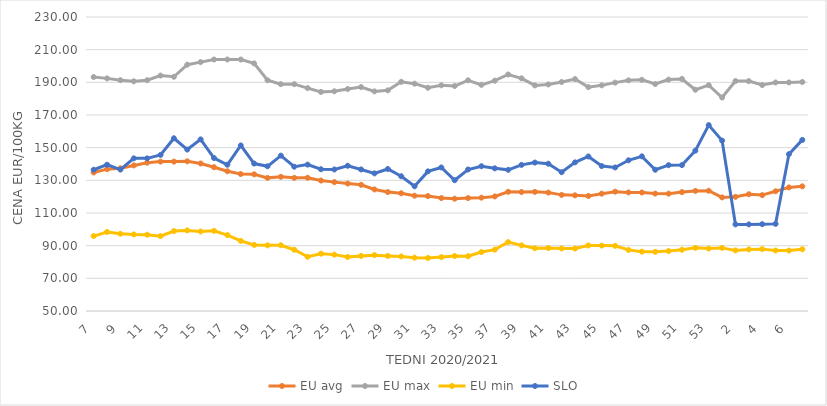
| Category | EU avg | EU max | EU min | SLO |
|---|---|---|---|---|
| 7.0 | 134.799 | 193.24 | 95.88 | 136.47 |
| 8.0 | 136.846 | 192.42 | 98.381 | 139.56 |
| 9.0 | 137.361 | 191.31 | 97.323 | 136.58 |
| 10.0 | 139.118 | 190.63 | 96.874 | 143.45 |
| 11.0 | 140.789 | 191.32 | 96.705 | 143.45 |
| 12.0 | 141.467 | 194.15 | 95.845 | 145.57 |
| 13.0 | 141.466 | 193.4 | 98.945 | 155.76 |
| 14.0 | 141.645 | 200.79 | 99.347 | 148.84 |
| 15.0 | 140.306 | 202.38 | 98.696 | 155.07 |
| 16.0 | 138.046 | 203.97 | 99.065 | 143.65 |
| 17.0 | 135.556 | 203.97 | 96.499 | 139.55 |
| 18.0 | 133.857 | 203.97 | 92.931 | 151.36 |
| 19.0 | 133.702 | 201.59 | 90.48 | 140.27 |
| 20.0 | 131.51 | 191.27 | 90.199 | 138.59 |
| 21.0 | 132.157 | 188.89 | 90.255 | 145.12 |
| 22.0 | 131.509 | 188.89 | 87.513 | 138.33 |
| 23.0 | 131.578 | 186.47 | 83.199 | 139.64 |
| 24.0 | 129.861 | 184.13 | 85.09 | 136.79 |
| 25.0 | 128.899 | 184.51 | 84.52 | 136.65 |
| 26.0 | 128.034 | 185.91 | 83.06 | 138.92 |
| 27.0 | 127.242 | 187.11 | 83.73 | 136.67 |
| 28.0 | 124.426 | 184.46 | 84.2 | 134.25 |
| 29.0 | 122.822 | 185.09 | 83.72 | 136.94 |
| 30.0 | 122.086 | 190.31 | 83.4 | 132.48 |
| 31.0 | 120.581 | 189.19 | 82.63 | 126.34 |
| 32.0 | 120.341 | 186.67 | 82.46 | 135.48 |
| 33.0 | 119.127 | 188.18 | 82.99 | 137.89 |
| 34.0 | 118.75 | 187.74 | 83.66 | 130.07 |
| 35.0 | 119.136 | 191.25 | 83.53 | 136.63 |
| 36.0 | 119.398 | 188.47 | 86.09 | 138.64 |
| 37.0 | 120.135 | 190.99 | 87.57 | 137.35 |
| 38.0 | 122.982 | 194.8 | 92.21 | 136.42 |
| 39.0 | 122.832 | 192.45 | 90.16 | 139.46 |
| 40.0 | 122.936 | 188.11 | 88.45 | 140.87 |
| 41.0 | 122.507 | 188.73 | 88.54 | 140.18 |
| 42.0 | 121.098 | 190.2 | 88.3 | 134.98 |
| 43.0 | 120.822 | 191.99 | 88.22 | 141 |
| 44.0 | 120.448 | 187.06 | 90.13 | 144.61 |
| 45.0 | 121.843 | 188.15 | 90.04 | 138.73 |
| 46.0 | 123.07 | 189.82 | 89.89 | 137.88 |
| 47.0 | 122.58 | 191.22 | 87.43 | 142.27 |
| 48.0 | 122.553 | 191.52 | 86.35 | 144.69 |
| 49.0 | 121.893 | 188.97 | 86.24 | 136.47 |
| 50.0 | 121.851 | 191.67 | 86.72 | 139.29 |
| 51.0 | 122.8 | 192.06 | 87.5 | 139.35 |
| 52.0 | 123.52 | 185.468 | 88.67 | 148.16 |
| 53.0 | 123.611 | 188.25 | 88.23 | 163.81 |
| 1.0 | 119.553 | 180.72 | 88.64 | 154.31 |
| 2.0 | 119.893 | 190.77 | 87.1 | 103.02 |
| 3.0 | 121.489 | 190.76 | 87.7 | 103.03 |
| 4.0 | 120.954 | 188.33 | 87.88 | 103.15 |
| 5.0 | 123.293 | 189.91 | 87.04 | 103.34 |
| 6.0 | 125.679 | 189.94 | 86.97 | 146.03 |
| 7.0 | 126.326 | 190.21 | 87.79 | 154.77 |